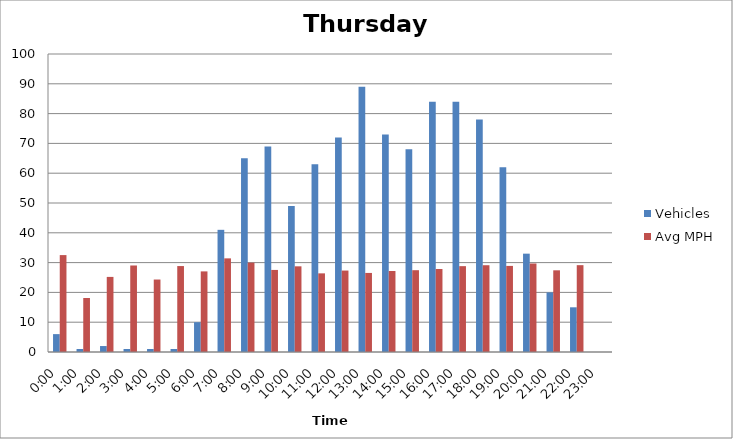
| Category | Vehicles | Avg MPH |
|---|---|---|
| 0:00 | 6 | 32.52 |
| 1:00 | 1 | 18.12 |
| 2:00 | 2 | 25.2 |
| 3:00 | 1 | 29.03 |
| 4:00 | 1 | 24.32 |
| 5:00 | 1 | 28.84 |
| 6:00 | 10 | 27.05 |
| 7:00 | 41 | 31.42 |
| 8:00 | 65 | 29.99 |
| 9:00 | 69 | 27.54 |
| 10:00 | 49 | 28.75 |
| 11:00 | 63 | 26.39 |
| 12:00 | 72 | 27.33 |
| 13:00 | 89 | 26.53 |
| 14:00 | 73 | 27.18 |
| 15:00 | 68 | 27.45 |
| 16:00 | 84 | 27.86 |
| 17:00 | 84 | 28.81 |
| 18:00 | 78 | 29.12 |
| 19:00 | 62 | 28.89 |
| 20:00 | 33 | 29.7 |
| 21:00 | 20 | 27.41 |
| 22:00 | 15 | 29.14 |
| 23:00 | 0 | 0 |